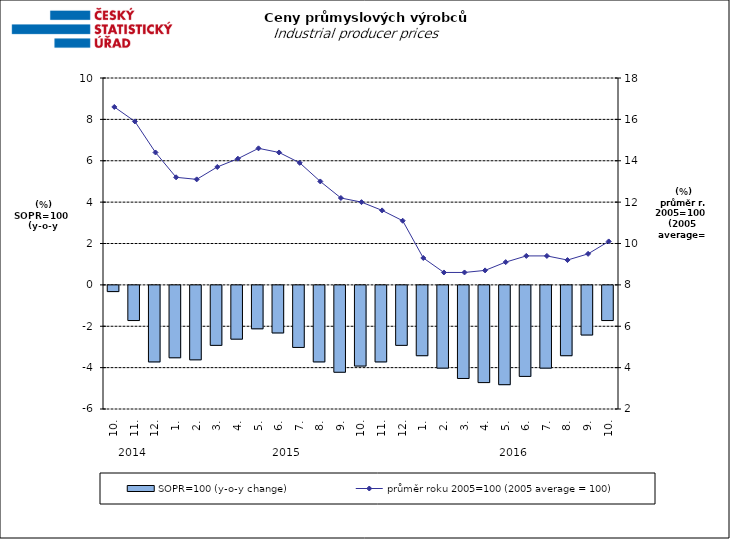
| Category | SOPR=100 (y-o-y change)   |
|---|---|
| 0 | -0.3 |
| 1 | -1.7 |
| 2 | -3.7 |
| 3 | -3.5 |
| 4 | -3.6 |
| 5 | -2.9 |
| 6 | -2.6 |
| 7 | -2.1 |
| 8 | -2.3 |
| 9 | -3 |
| 10 | -3.7 |
| 11 | -4.2 |
| 12 | -3.9 |
| 13 | -3.7 |
| 14 | -2.9 |
| 15 | -3.4 |
| 16 | -4 |
| 17 | -4.5 |
| 18 | -4.7 |
| 19 | -4.8 |
| 20 | -4.4 |
| 21 | -4 |
| 22 | -3.4 |
| 23 | -2.4 |
| 24 | -1.7 |